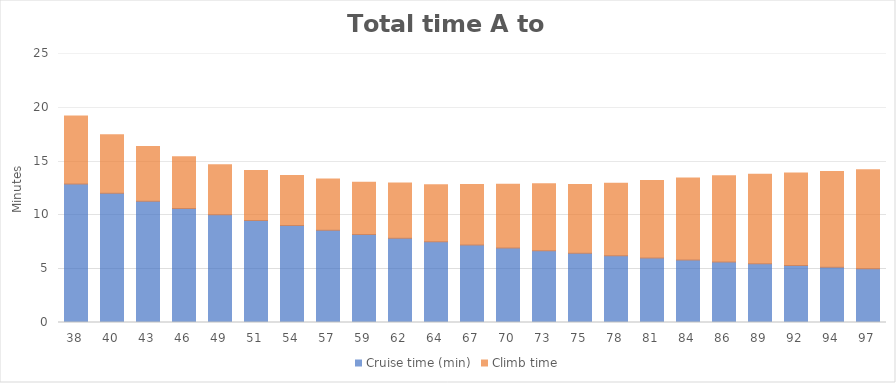
| Category | Cruise time (min) | Climb time |
|---|---|---|
| 38 | 12.865 | 6.319 |
| 40 | 12.008 | 5.444 |
| 43 | 11.257 | 5.104 |
| 46 | 10.595 | 4.804 |
| 49 | 10.006 | 4.663 |
| 51 | 9.48 | 4.656 |
| 54 | 9.006 | 4.65 |
| 57 | 8.577 | 4.753 |
| 59 | 8.187 | 4.846 |
| 62 | 7.831 | 5.128 |
| 64 | 7.505 | 5.293 |
| 67 | 7.205 | 5.625 |
| 70 | 6.928 | 5.933 |
| 73 | 6.671 | 6.217 |
| 75 | 6.433 | 6.4 |
| 78 | 6.211 | 6.727 |
| 81 | 6.004 | 7.183 |
| 84 | 5.81 | 7.61 |
| 86 | 5.629 | 8.01 |
| 89 | 5.458 | 8.317 |
| 92 | 5.298 | 8.606 |
| 94 | 5.146 | 8.879 |
| 97 | 5.003 | 9.199 |